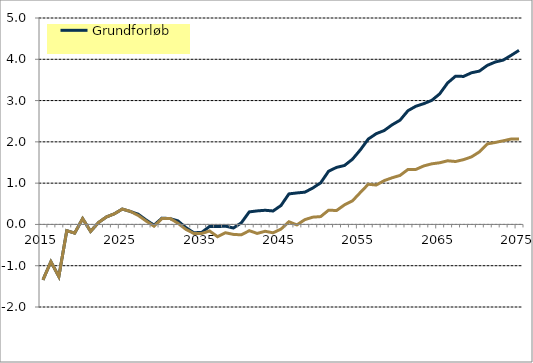
| Category | Grundforløb | Konstant livsandel |
|---|---|---|
| 2015-01-01 | -1.343 | -1.343 |
| 2016-01-01 | -0.903 | -0.903 |
| 2017-01-01 | -1.263 | -1.263 |
| 2018-01-01 | -0.152 | -0.152 |
| 2019-01-01 | -0.21 | -0.21 |
| 2020-01-01 | 0.142 | 0.142 |
| 2021-01-01 | -0.169 | -0.169 |
| 2022-01-01 | 0.046 | 0.046 |
| 2023-01-01 | 0.182 | 0.182 |
| 2024-01-01 | 0.257 | 0.257 |
| 2025-01-01 | 0.372 | 0.372 |
| 2026-01-01 | 0.314 | 0.316 |
| 2027-01-01 | 0.248 | 0.22 |
| 2028-01-01 | 0.108 | 0.083 |
| 2029-01-01 | -0.018 | -0.043 |
| 2030-01-01 | 0.153 | 0.141 |
| 2031-01-01 | 0.142 | 0.147 |
| 2032-01-01 | 0.087 | 0.03 |
| 2033-01-01 | -0.074 | -0.118 |
| 2034-01-01 | -0.201 | -0.218 |
| 2035-01-01 | -0.194 | -0.219 |
| 2036-01-01 | -0.047 | -0.159 |
| 2037-01-01 | -0.053 | -0.297 |
| 2038-01-01 | -0.041 | -0.201 |
| 2039-01-01 | -0.087 | -0.241 |
| 2040-01-01 | 0.039 | -0.252 |
| 2041-01-01 | 0.304 | -0.152 |
| 2042-01-01 | 0.328 | -0.218 |
| 2043-01-01 | 0.343 | -0.166 |
| 2044-01-01 | 0.326 | -0.203 |
| 2045-01-01 | 0.459 | -0.113 |
| 2046-01-01 | 0.74 | 0.065 |
| 2047-01-01 | 0.763 | -0.012 |
| 2048-01-01 | 0.781 | 0.116 |
| 2049-01-01 | 0.881 | 0.176 |
| 2050-01-01 | 1.008 | 0.19 |
| 2051-01-01 | 1.288 | 0.346 |
| 2052-01-01 | 1.382 | 0.337 |
| 2053-01-01 | 1.427 | 0.474 |
| 2054-01-01 | 1.578 | 0.57 |
| 2055-01-01 | 1.806 | 0.774 |
| 2056-01-01 | 2.068 | 0.973 |
| 2057-01-01 | 2.198 | 0.954 |
| 2058-01-01 | 2.273 | 1.061 |
| 2059-01-01 | 2.412 | 1.13 |
| 2060-01-01 | 2.524 | 1.187 |
| 2061-01-01 | 2.754 | 1.331 |
| 2062-01-01 | 2.863 | 1.333 |
| 2063-01-01 | 2.925 | 1.418 |
| 2064-01-01 | 3.005 | 1.468 |
| 2065-01-01 | 3.162 | 1.494 |
| 2066-01-01 | 3.427 | 1.541 |
| 2067-01-01 | 3.591 | 1.524 |
| 2068-01-01 | 3.585 | 1.569 |
| 2069-01-01 | 3.673 | 1.635 |
| 2070-01-01 | 3.714 | 1.756 |
| 2071-01-01 | 3.852 | 1.95 |
| 2072-01-01 | 3.934 | 1.986 |
| 2073-01-01 | 3.979 | 2.026 |
| 2074-01-01 | 4.094 | 2.069 |
| 2075-01-01 | 4.217 | 2.07 |